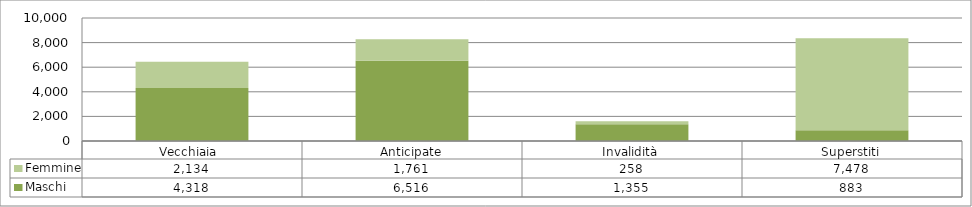
| Category | Maschi | Femmine |
|---|---|---|
| Vecchiaia  | 4318 | 2134 |
| Anticipate | 6516 | 1761 |
| Invalidità | 1355 | 258 |
| Superstiti | 883 | 7478 |